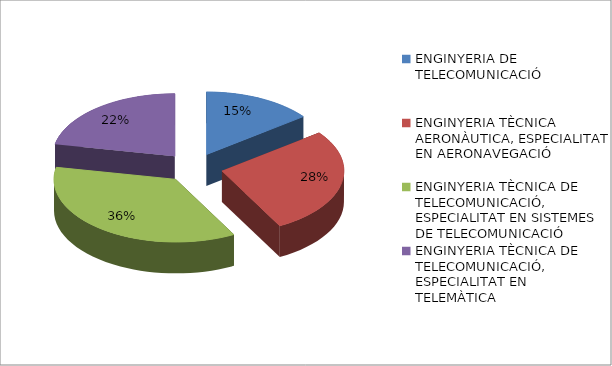
| Category | Series 0 |
|---|---|
| ENGINYERIA DE TELECOMUNICACIÓ | 0.146 |
| ENGINYERIA TÈCNICA AERONÀUTICA, ESPECIALITAT EN AERONAVEGACIÓ | 0.275 |
| ENGINYERIA TÈCNICA DE TELECOMUNICACIÓ, ESPECIALITAT EN SISTEMES DE TELECOMUNICACIÓ | 0.36 |
| ENGINYERIA TÈCNICA DE TELECOMUNICACIÓ, ESPECIALITAT EN TELEMÀTICA | 0.219 |